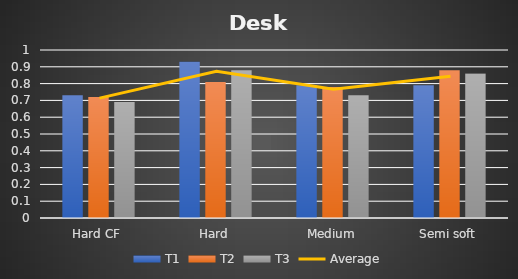
| Category | T1 | T2 | T3 |
|---|---|---|---|
| Hard CF | 0.73 | 0.72 | 0.69 |
| Hard | 0.93 | 0.81 | 0.88 |
| Medium | 0.79 | 0.78 | 0.73 |
| Semi soft | 0.79 | 0.88 | 0.86 |